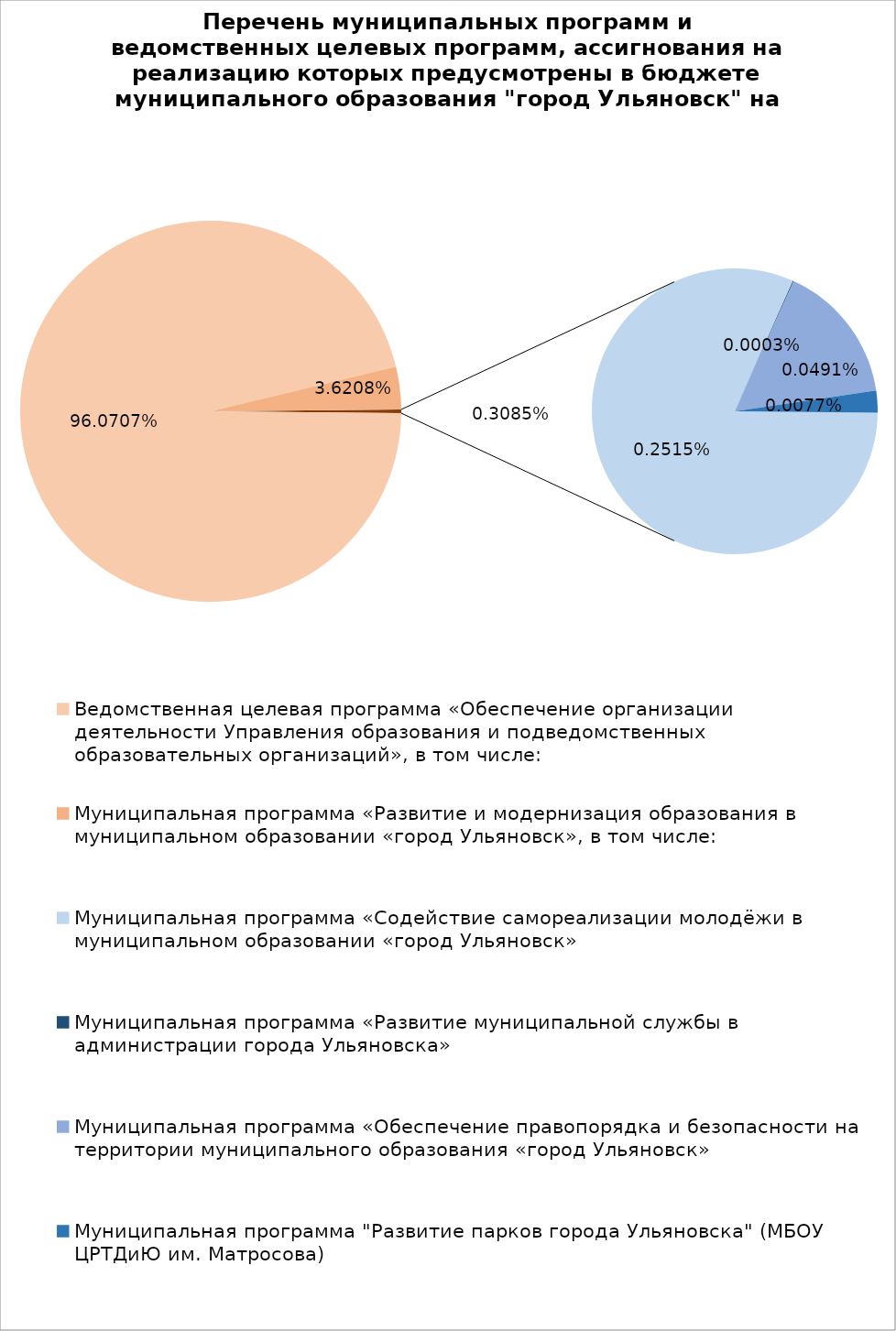
| Category | Series 0 |
|---|---|
| Ведомственная целевая программа «Обеспечение организации деятельности Управления образования и подведомственных образовательных организаций», в том числе: | 5022024.36 |
| Муниципальная программа «Развитие и модернизация образования в муниципальном образовании «город Ульяновск», в том числе: | 189272.7 |
| Муниципальная программа «Содействие самореализации молодёжи в муниципальном образовании «город Ульяновск» | 13148.32 |
| Муниципальная программа «Развитие муниципальной службы в администрации города Ульяновска» | 15.4 |
| Муниципальная программа «Обеспечение правопорядка и безопасности на территории муниципального образования «город Ульяновск» | 2565 |
| Муниципальная программа "Развитие парков города Ульяновска" (МБОУ ЦРТДиЮ им. Матросова) | 400 |